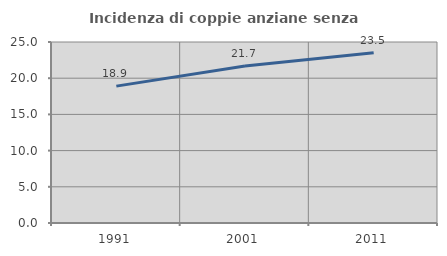
| Category | Incidenza di coppie anziane senza figli  |
|---|---|
| 1991.0 | 18.908 |
| 2001.0 | 21.675 |
| 2011.0 | 23.529 |